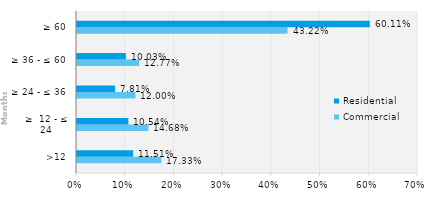
| Category | Commercial | Residential |
|---|---|---|
| >12 | 0.173 | 0.115 |
| ≥  12 - ≤ 24 | 0.147 | 0.105 |
| ≥ 24 - ≤ 36 | 0.12 | 0.078 |
| ≥ 36 - ≤ 60 | 0.128 | 0.1 |
| ≥ 60 | 0.432 | 0.601 |